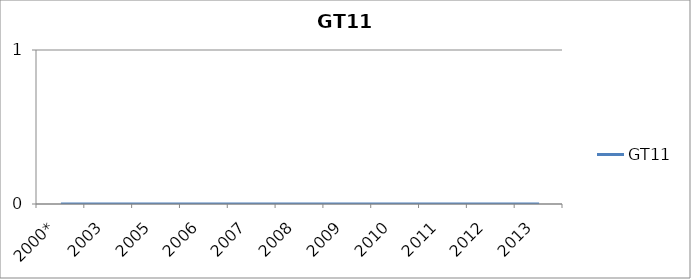
| Category | GT11 |
|---|---|
| 2000* | 0 |
| 2003 | 0 |
| 2005 | 0 |
| 2006 | 0 |
| 2007 | 0 |
| 2008 | 0 |
| 2009 | 0 |
| 2010 | 0 |
| 2011 | 0 |
| 2012 | 0 |
| 2013 | 0 |